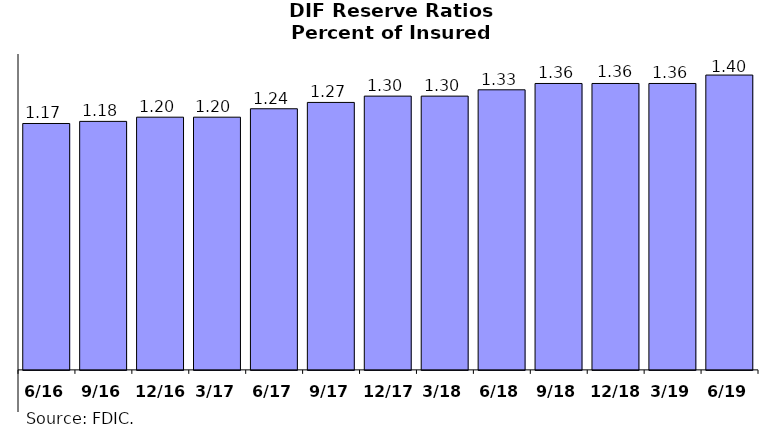
| Category | Series 0 |
|---|---|
| 6/16 | 1.17 |
| 9/16 | 1.18 |
| 12/16 | 1.2 |
| 3/17 | 1.2 |
| 6/17 | 1.24 |
| 9/17 | 1.27 |
| 12/17 | 1.3 |
| 3/18 | 1.3 |
| 6/18 | 1.33 |
| 9/18 | 1.36 |
| 12/18 | 1.36 |
| 3/19 | 1.36 |
| 6/19 | 1.4 |